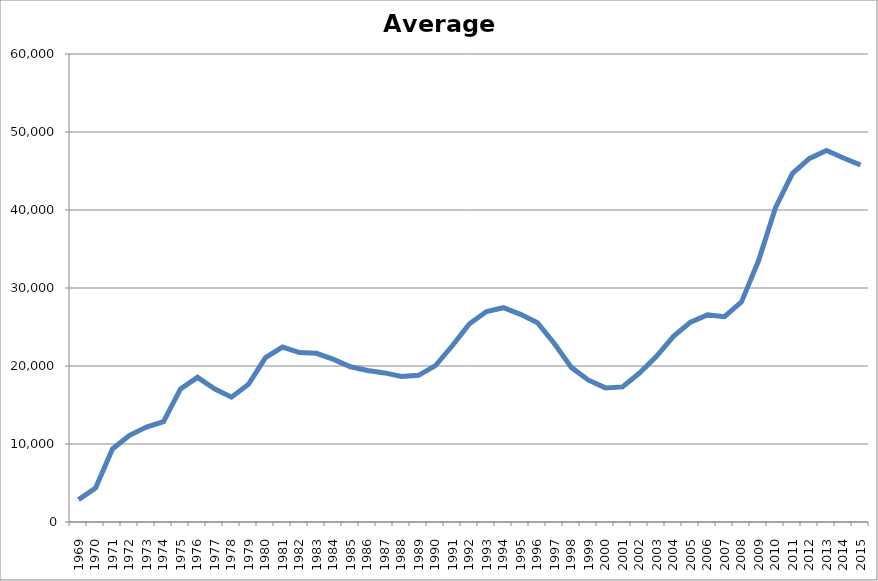
| Category | Average Participation |
|---|---|
| 1969.0 | 2878 |
| 1970.0 | 4340 |
| 1971.0 | 9368 |
| 1972.0 | 11109 |
| 1973.0 | 12166 |
| 1974.0 | 12862 |
| 1975.0 | 17064 |
| 1976.0 | 18549 |
| 1977.0 | 17077 |
| 1978.0 | 16001 |
| 1979.0 | 17653 |
| 1980.0 | 21082 |
| 1981.0 | 22430 |
| 1982.0 | 21717 |
| 1983.0 | 21625 |
| 1984.0 | 20854 |
| 1985.0 | 19899 |
| 1986.0 | 19429 |
| 1987.0 | 19113 |
| 1988.0 | 18645 |
| 1989.0 | 18806.463 |
| 1990.0 | 20048.978 |
| 1991.0 | 22624.627 |
| 1992.0 | 25406.985 |
| 1993.0 | 26986.774 |
| 1994.0 | 27473.696 |
| 1995.0 | 26618.773 |
| 1996.0 | 25542.531 |
| 1997.0 | 22858.136 |
| 1998.0 | 19790.984 |
| 1999.0 | 18182.538 |
| 2000.0 | 17194.334 |
| 2001.0 | 17318.458 |
| 2002.0 | 19095.637 |
| 2003.0 | 21249.626 |
| 2004.0 | 23810.742 |
| 2005.0 | 25628.456 |
| 2006.0 | 26548.833 |
| 2007.0 | 26316.045 |
| 2008.0 | 28222.63 |
| 2009.0 | 33489.974 |
| 2010.0 | 40301.878 |
| 2011.0 | 44708.726 |
| 2012.0 | 46609.072 |
| 2013.0 | 47636.09 |
| 2014.0 | 46663.616 |
| 2015.0 | 45766.672 |